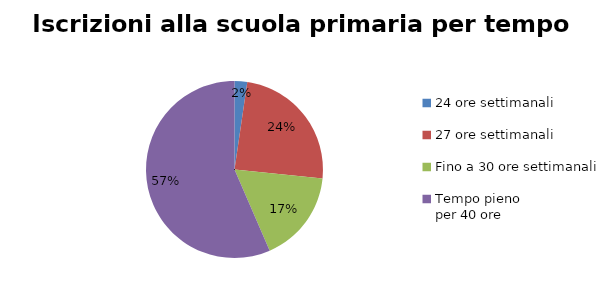
| Category | Series 0 |
|---|---|
| 24 ore settimanali | 806 |
| 27 ore settimanali | 8443 |
| Fino a 30 ore settimanali | 5869 |
| Tempo pieno 
per 40 ore | 19647 |